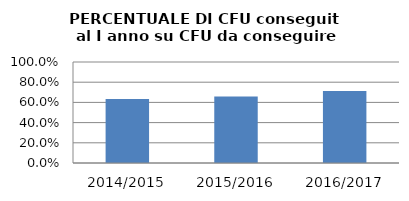
| Category | 2014/2015 2015/2016 2016/2017 |
|---|---|
| 2014/2015 | 0.633 |
| 2015/2016 | 0.659 |
| 2016/2017 | 0.713 |